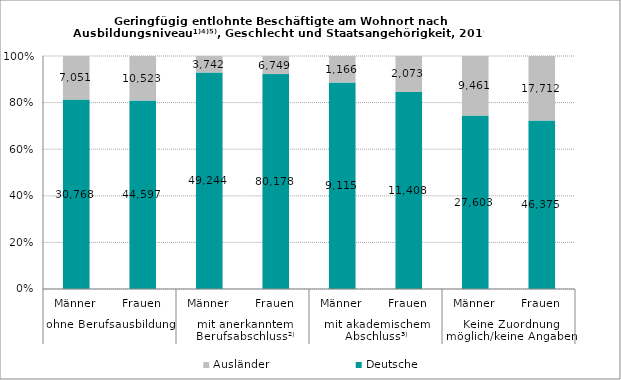
| Category | Deutsche | Ausländer |
|---|---|---|
| 0 | 30768 | 7051 |
| 1 | 44597 | 10523 |
| 2 | 49244 | 3742 |
| 3 | 80178 | 6749 |
| 4 | 9115 | 1166 |
| 5 | 11408 | 2073 |
| 6 | 27603 | 9461 |
| 7 | 46375 | 17712 |